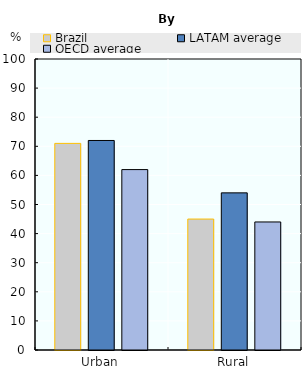
| Category | Brazil | LATAM average | OECD average |
|---|---|---|---|
| Urban | 71 | 72 | 62 |
| Rural | 45 | 54 | 44 |